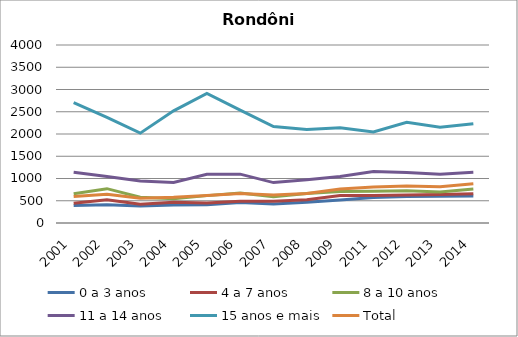
| Category | 0 a 3 anos | 4 a 7 anos | 8 a 10 anos | 11 a 14 anos | 15 anos e mais | Total |
|---|---|---|---|---|---|---|
| 2001.0 | 391.4 | 443 | 655.4 | 1141.8 | 2704.9 | 595 |
| 2002.0 | 411.2 | 520.2 | 771.5 | 1046.5 | 2374.5 | 648.2 |
| 2003.0 | 384.1 | 423.3 | 580.7 | 945.2 | 2019.2 | 558.2 |
| 2004.0 | 401.8 | 468.7 | 543.8 | 912.7 | 2520.3 | 578.3 |
| 2005.0 | 408 | 447.3 | 615.3 | 1095.6 | 2910.6 | 615.7 |
| 2006.0 | 462.7 | 488.8 | 676.5 | 1097.6 | 2537.9 | 664.7 |
| 2007.0 | 429.5 | 489.5 | 590.2 | 908.3 | 2167.5 | 629.5 |
| 2008.0 | 465.7 | 520 | 660.3 | 969.4 | 2103.4 | 661.2 |
| 2009.0 | 516 | 615.3 | 707.1 | 1045.5 | 2139.6 | 761.4 |
| 2011.0 | 570.9 | 619.5 | 714.4 | 1159.1 | 2047.9 | 807.2 |
| 2012.0 | 594.6 | 631 | 722 | 1137.4 | 2260.9 | 831.4 |
| 2013.0 | 600.1 | 639 | 698 | 1096.5 | 2150.9 | 816.3 |
| 2014.0 | 605.8 | 659.1 | 763 | 1138.3 | 2230.7 | 879.9 |